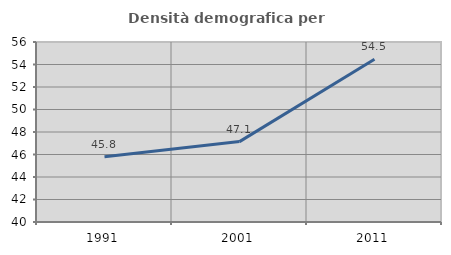
| Category | Densità demografica |
|---|---|
| 1991.0 | 45.79 |
| 2001.0 | 47.147 |
| 2011.0 | 54.475 |